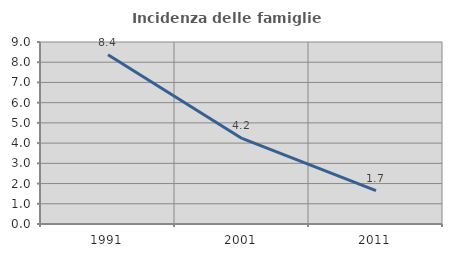
| Category | Incidenza delle famiglie numerose |
|---|---|
| 1991.0 | 8.373 |
| 2001.0 | 4.231 |
| 2011.0 | 1.652 |